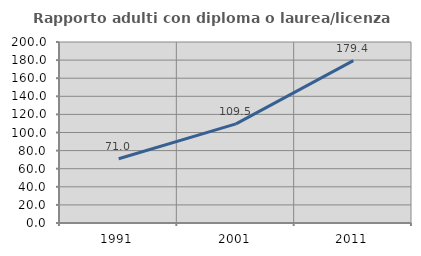
| Category | Rapporto adulti con diploma o laurea/licenza media  |
|---|---|
| 1991.0 | 71.048 |
| 2001.0 | 109.499 |
| 2011.0 | 179.384 |